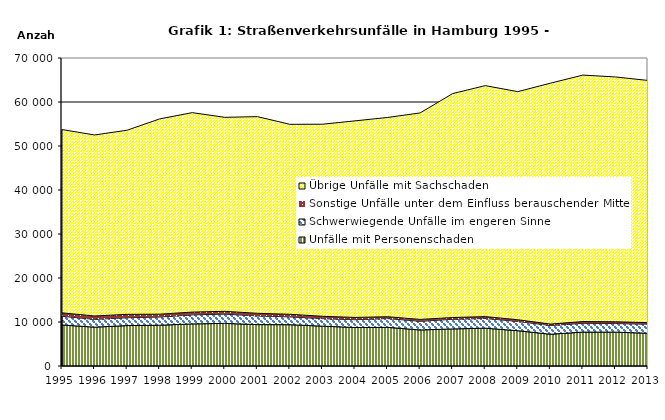
| Category | Unfälle mit Personenschaden | Schwerwiegende Unfälle im engeren Sinne | Sonstige Unfälle unter dem Einfluss berauschender Mittel 1) | Übrige Unfälle mit Sachschaden |
|---|---|---|---|---|
| 1995.0 | 9323 | 1981 | 775 | 41654 |
| 1996.0 | 8827 | 1775 | 772 | 41133 |
| 1997.0 | 9186 | 1789 | 763 | 41852 |
| 1998.0 | 9264 | 1869 | 648 | 44374 |
| 1999.0 | 9566 | 2055 | 634 | 45326 |
| 2000.0 | 9684 | 2114 | 632 | 44087 |
| 2001.0 | 9410 | 1972 | 596 | 44696 |
| 2002.0 | 9383 | 1782 | 592 | 43169 |
| 2003.0 | 9058 | 1702 | 542 | 43646 |
| 2004.0 | 8755 | 1770 | 513 | 44673 |
| 2005.0 | 8788 | 1991 | 422 | 45281 |
| 2006.0 | 8190 | 1977 | 424 | 46926 |
| 2007.0 | 8426 | 2186 | 404 | 50897 |
| 2008.0 | 8594 | 2206 | 432 | 52488 |
| 2009.0 | 8022 | 2115 | 380 | 51835 |
| 2010.0 | 7217 | 1987 | 324 | 54741 |
| 2011.0 | 7704 | 2003 | 394 | 56014 |
| 2012.0 | 7691 | 1958 | 401 | 55640 |
| 2013.0 | 7443 | 2059 | 355 | 55040 |